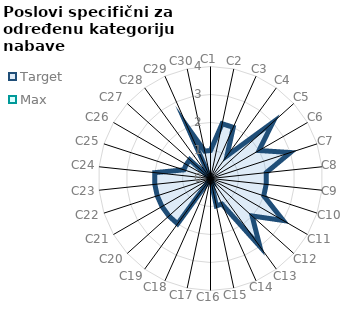
| Category | Target | Max |
|---|---|---|
| C1 | 1 | 0 |
| C2 | 2 | 0 |
| C3 | 2 | 0 |
| C4 | 1 | 0 |
| C5 | 3 | 0 |
| C6 | 2 | 0 |
| C7 | 3 | 0 |
| C8 | 2 | 0 |
| C9 | 2 | 0 |
| C10 | 2 | 0 |
| C11 | 3 | 0 |
| C12 | 2 | 0 |
| C13 | 3 | 0 |
| C14 | 1 | 0 |
| C15 | 1 | 0 |
| C16 | 0 | 0 |
| C17 | 0 | 0 |
| C18 | 0 | 0 |
| C19 | 2 | 0 |
| C20 | 2 | 0 |
| C21 | 2 | 0 |
| C22 | 2 | 0 |
| C23 | 2 | 0 |
| C24 | 2 | 0 |
| C25 | 1 | 0 |
| C26 | 1 | 0 |
| C27 | 1 | 0 |
| C28 | 0 | 0 |
| C29 | 2 | 0 |
| C30 | 1 | 0 |